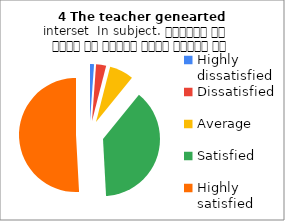
| Category | 4 The teacher genearted interset  In subject. शिक्षक ने विषय के प्रति रुचि जागृत की |
|---|---|
| Highly dissatisfied | 2 |
| Dissatisfied | 5 |
| Average | 12 |
| Satisfied | 67 |
| Highly satisfied | 89 |